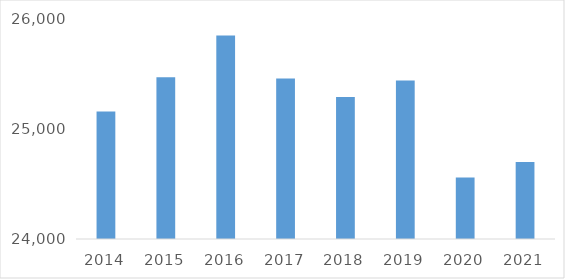
| Category | Series 0 |
|---|---|
| 2014.0 | 25160 |
| 2015.0 | 25470 |
| 2016.0 | 25850 |
| 2017.0 | 25460 |
| 2018.0 | 25290 |
| 2019.0 | 25440 |
| 2020.0 | 24560 |
| 2021.0 | 24700 |